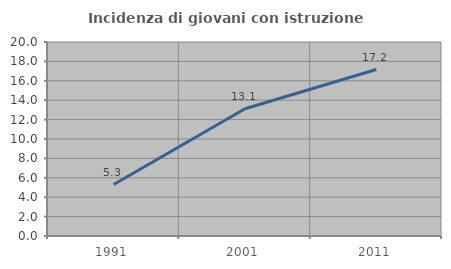
| Category | Incidenza di giovani con istruzione universitaria |
|---|---|
| 1991.0 | 5.303 |
| 2001.0 | 13.125 |
| 2011.0 | 17.16 |